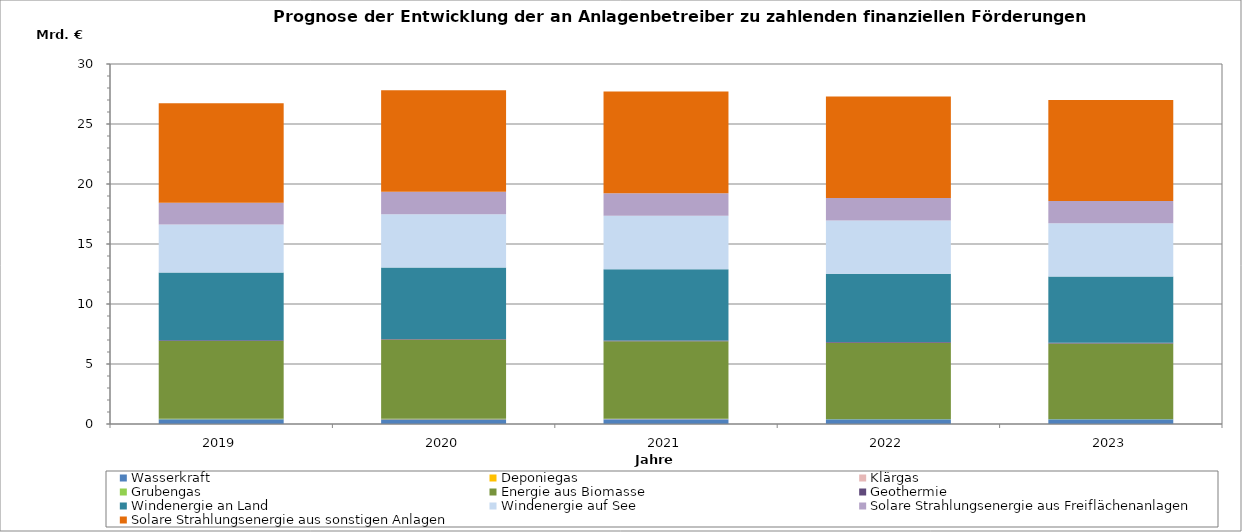
| Category | Wasserkraft | Deponiegas | Klärgas | Grubengas | Energie aus Biomasse | Geothermie | Windenergie an Land | Windenergie auf See | Solare Strahlungsenergie aus Freiflächenanlagen | Solare Strahlungsenergie aus sonstigen Anlagen |
|---|---|---|---|---|---|---|---|---|---|---|
| 2019 | 387.587 | 14.222 | 3.565 | 25.556 | 6492.802 | 48.473 | 5655.509 | 3992.338 | 1809.545 | 8298.219 |
| 2020 | 396.123 | 13.38 | 3.567 | 25.986 | 6596.413 | 52.897 | 5944.181 | 4456.226 | 1861.107 | 8456.295 |
| 2021 | 398.684 | 7.11 | 1.834 | 21.053 | 6476.819 | 56.73 | 5924.409 | 4465.171 | 1875.336 | 8489.964 |
| 2022 | 394.511 | 5.121 | 1.466 | 18.262 | 6354.908 | 59.969 | 5686.013 | 4439.918 | 1863.78 | 8475.359 |
| 2023 | 393.267 | 4.498 | 1.405 | 11.293 | 6291.475 | 63.131 | 5519.043 | 4441.173 | 1854.097 | 8421.155 |